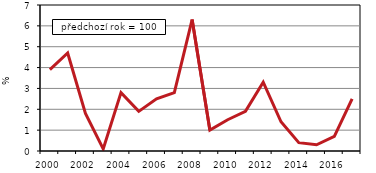
| Category | Series 0 |
|---|---|
| 2000.0 | 3.9 |
| 2001.0 | 4.7 |
| 2002.0 | 1.8 |
| 2003.0 | 0.1 |
| 2004.0 | 2.8 |
| 2005.0 | 1.9 |
| 2006.0 | 2.5 |
| 2007.0 | 2.8 |
| 2008.0 | 6.3 |
| 2009.0 | 1 |
| 2010.0 | 1.5 |
| 2011.0 | 1.9 |
| 2012.0 | 3.3 |
| 2013.0 | 1.4 |
| 2014.0 | 0.4 |
| 2015.0 | 0.3 |
| 2016.0 | 0.7 |
| 2017.0 | 2.5 |